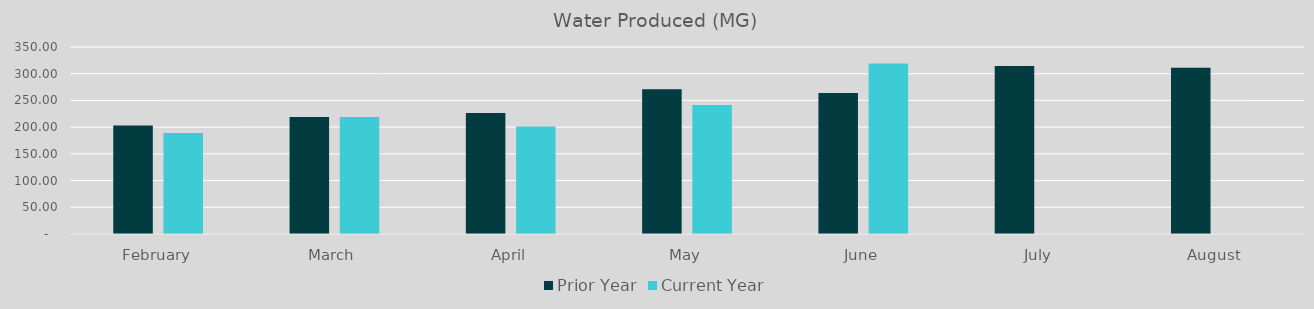
| Category | Prior Year | Current Year |
|---|---|---|
| February | 202.92 | 189.14 |
| March | 218.89 | 218.9 |
| April | 226.62 | 201.4 |
| May | 270.85 | 241.3 |
| June | 263.67 | 318.9 |
| July | 314.55 | 0 |
| August | 311.17 | 0 |